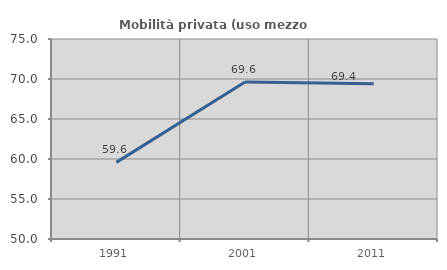
| Category | Mobilità privata (uso mezzo privato) |
|---|---|
| 1991.0 | 59.58 |
| 2001.0 | 69.615 |
| 2011.0 | 69.391 |